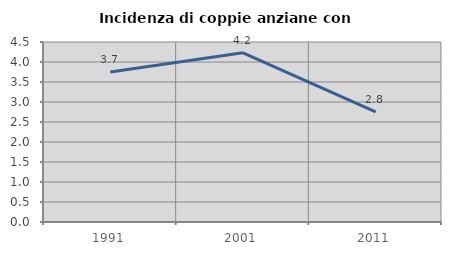
| Category | Incidenza di coppie anziane con figli |
|---|---|
| 1991.0 | 3.748 |
| 2001.0 | 4.23 |
| 2011.0 | 2.751 |